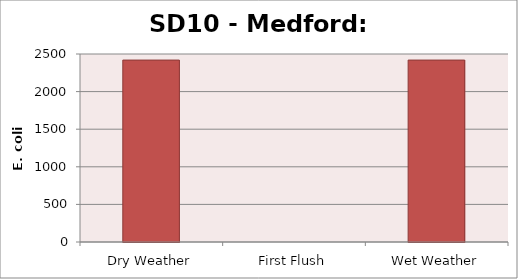
| Category | E. coli MPN |
|---|---|
| Dry Weather | 2419.2 |
| First Flush | 0 |
| Wet Weather | 2419.2 |